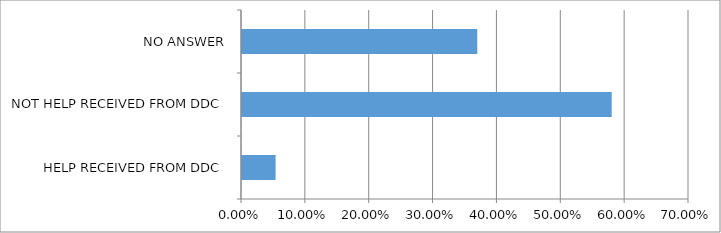
| Category | Series 0 |
|---|---|
| HELP RECEIVED FROM DDC | 0.053 |
| NOT HELP RECEIVED FROM DDC | 0.579 |
| NO ANSWER | 0.368 |